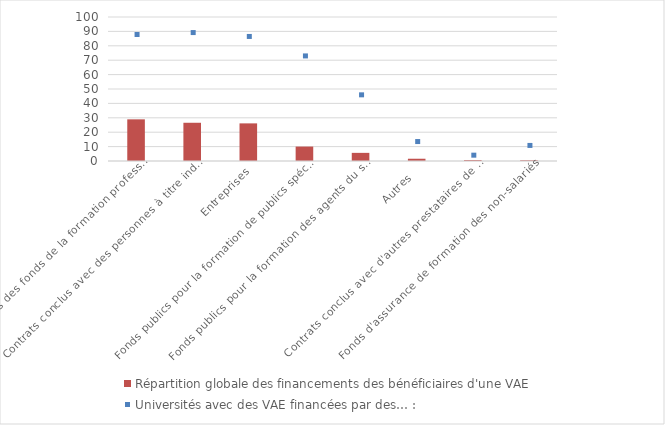
| Category | Répartition globale des financements des bénéficiaires d'une VAE  |
|---|---|
| Gestionnaires des fonds de la formation professionnelle | 28.93 |
| Contrats conclus avec des personnes à titre individuel et à leurs frais | 26.55 |
| Entreprises | 26.13 |
| Fonds publics pour la formation de publics spécifiques (Europe, État, conseils régionaux, Pôle emploi, autres ressources publiques) | 10.02 |
| Fonds publics pour la formation des agents du service public | 5.65 |
| Autres  | 1.57 |
| Contrats conclus avec d'autres prestataires de VAE | 0.64 |
| Fonds d'assurance de formation des non-salariés | 0.5 |